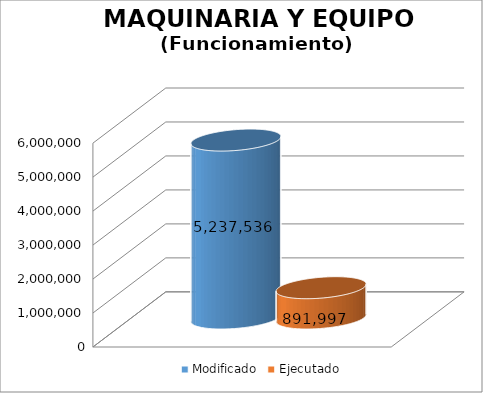
| Category | Modificado | Ejecutado |
|---|---|---|
| 0 | 5237536 | 891996.91 |